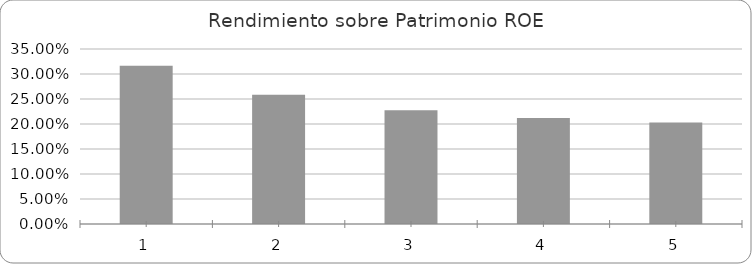
| Category | Series 0 |
|---|---|
| 0 | 0.316 |
| 1 | 0.259 |
| 2 | 0.227 |
| 3 | 0.212 |
| 4 | 0.203 |